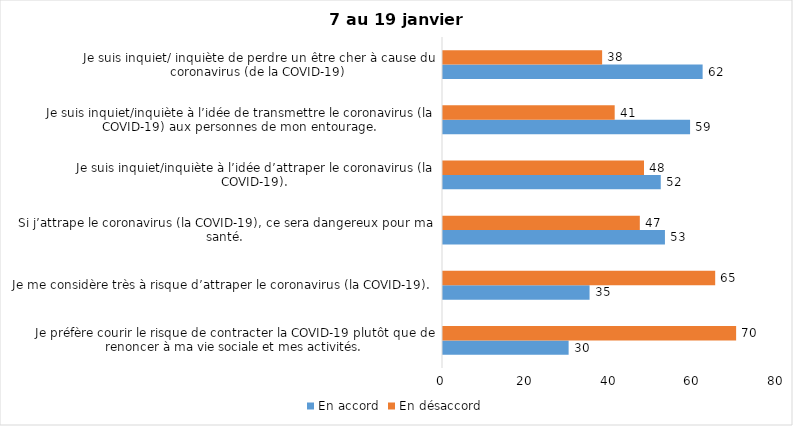
| Category | En accord | En désaccord |
|---|---|---|
| Je préfère courir le risque de contracter la COVID-19 plutôt que de renoncer à ma vie sociale et mes activités. | 30 | 70 |
| Je me considère très à risque d’attraper le coronavirus (la COVID-19). | 35 | 65 |
| Si j’attrape le coronavirus (la COVID-19), ce sera dangereux pour ma santé. | 53 | 47 |
| Je suis inquiet/inquiète à l’idée d’attraper le coronavirus (la COVID-19). | 52 | 48 |
| Je suis inquiet/inquiète à l’idée de transmettre le coronavirus (la COVID-19) aux personnes de mon entourage. | 59 | 41 |
| Je suis inquiet/ inquiète de perdre un être cher à cause du coronavirus (de la COVID-19) | 62 | 38 |